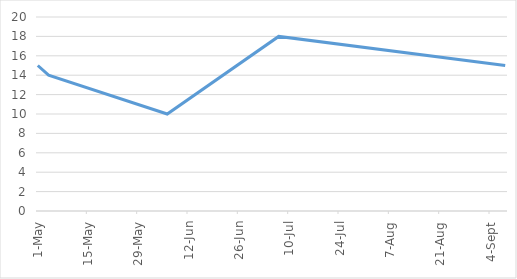
| Category | Series 0 |
|---|---|
| 2017-05-01 | 15 |
| 2017-05-04 | 14 |
| 2017-06-06 | 10 |
| 2017-07-07 | 18 |
| 2017-09-08 | 15 |